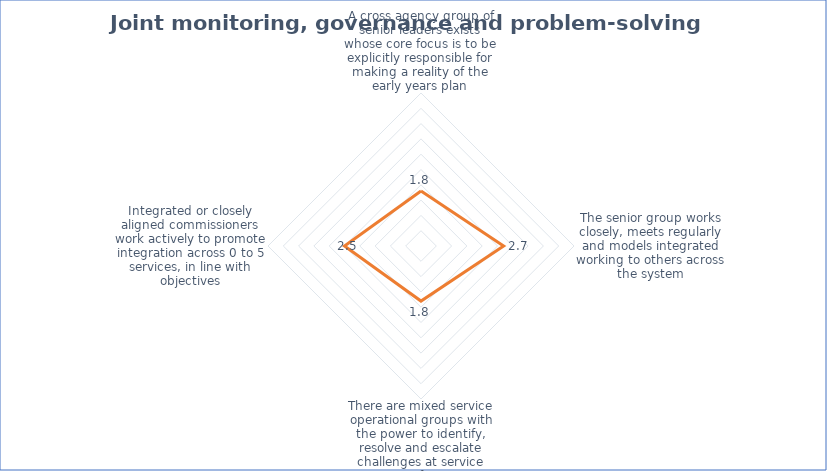
| Category | Series 0 |
|---|---|
| A cross agency group of senior leaders exists whose core focus is to be explicitly responsible for making a reality of the early years plan | 1.8 |
| The senior group works closely, meets regularly and models integrated working to others across the system | 2.7 |
| There are mixed service operational groups with the power to identify, resolve and escalate challenges at service interfaces | 1.8 |
| Integrated or closely aligned commissioners work actively to promote integration across 0 to 5 services, in line with objectives | 2.5 |